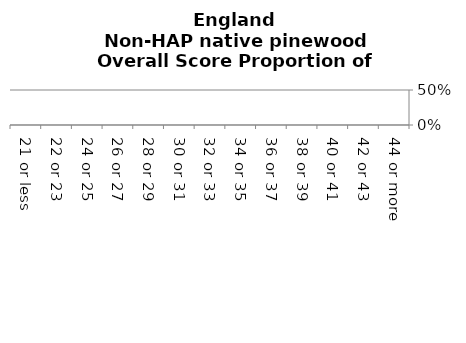
| Category | Non-HAP native pinewood |
|---|---|
| 21 or less | 0 |
| 22 or 23 | 0 |
| 24 or 25 | 0 |
| 26 or 27 | 0 |
| 28 or 29 | 0 |
| 30 or 31 | 0 |
| 32 or 33 | 0 |
| 34 or 35 | 0 |
| 36 or 37 | 0 |
| 38 or 39 | 0 |
| 40 or 41 | 0 |
| 42 or 43 | 0 |
| 44 or more | 0 |